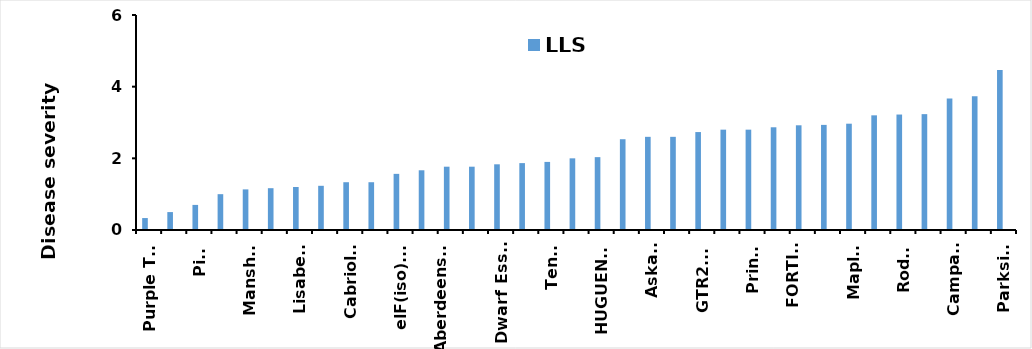
| Category | LLS | #REF! |
|---|---|---|
| Purple Top | 0.333 |  |
| Imola  | 0.5 |  |
| Pike | 0.7 |  |
| Capitol | 1 |  |
| Mansholt | 1.133 |  |
| Temple | 1.167 |  |
| Lisabeth | 1.2 |  |
| CER4-LIKE.A1  | 1.233 |  |
| Cabriolet | 1.333 |  |
| Escort | 1.333 |  |
| elF(iso).C8 | 1.567 |  |
| Bangholm PT | 1.667 |  |
| Aberdeenshire Prize | 1.767 |  |
| Elgar | 1.767 |  |
| Dwarf Essex | 1.833 |  |
| VTE4.C2a/b | 1.867 |  |
| Tenor | 1.9 |  |
| Smart | 2 |  |
| HUGUENOT | 2.033 |  |
| Cyt P450.C4a (1708) | 2.533 |  |
| Askari | 2.6 |  |
| Cyt P450.C4a(1411) | 2.6 |  |
| GTR2.A6 | 2.733 |  |
| KOHALIK SININE | 2.8 |  |
| Prince | 2.8 |  |
| Castille | 2.867 |  |
| FORTIN FAMILY | 2.922 |  |
| Orlando | 2.933 |  |
| Maplus | 2.967 |  |
| WILD ACCESSION | 3.2 |  |
| Rodeo | 3.222 |  |
| Diamant | 3.233 |  |
| Campari | 3.667 |  |
| Alesi | 3.733 |  |
| Parkside | 4.467 |  |